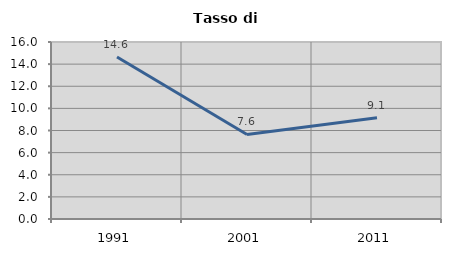
| Category | Tasso di disoccupazione   |
|---|---|
| 1991.0 | 14.642 |
| 2001.0 | 7.639 |
| 2011.0 | 9.145 |